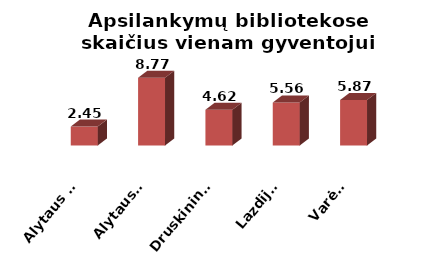
| Category | Series 0 |
|---|---|
| Alytaus m. | 2.447 |
| Alytaus r. | 8.766 |
| Druskininkai | 4.623 |
| Lazdijai | 5.563 |
| Varėna | 5.872 |